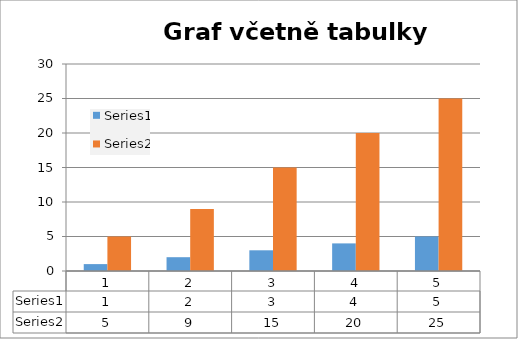
| Category | Series 0 | Series 1 |
|---|---|---|
| 0 | 1 | 5 |
| 1 | 2 | 9 |
| 2 | 3 | 15 |
| 3 | 4 | 20 |
| 4 | 5 | 25 |